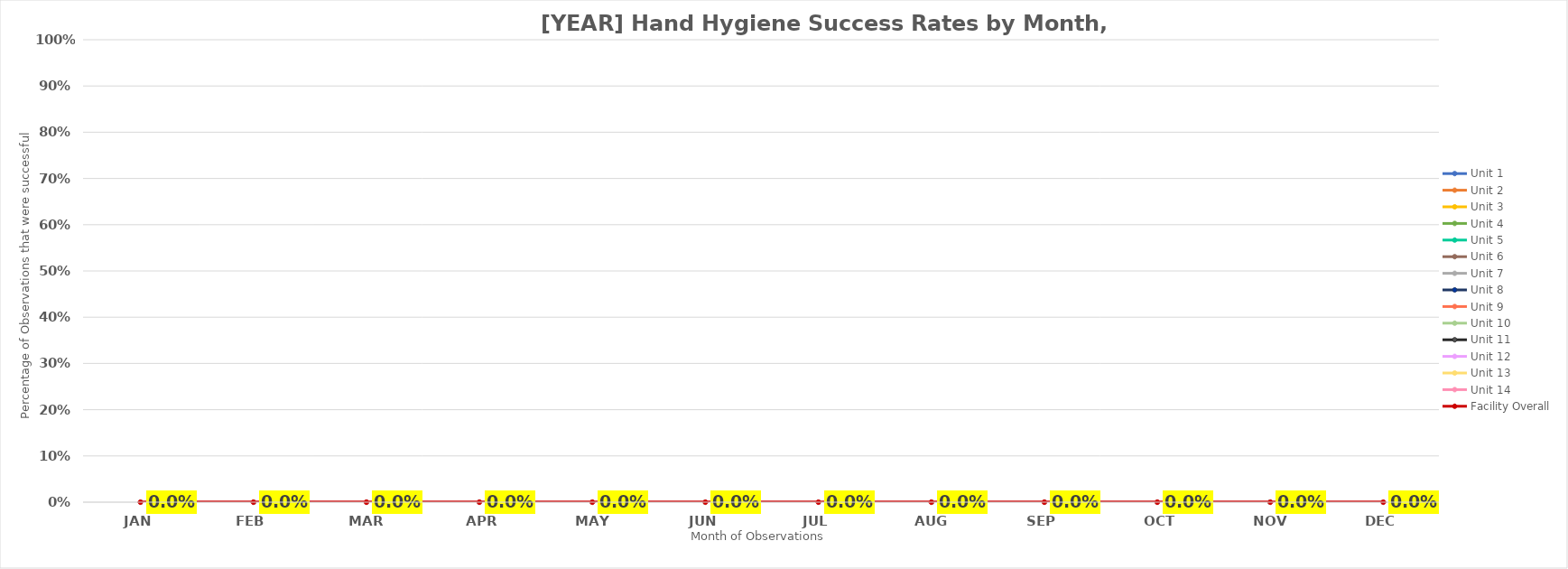
| Category | Unit 1 | Unit 2 | Unit 3 | Unit 4 | Unit 5 | Unit 6 | Unit 7 | Unit 8 | Unit 9 | Unit 10 | Unit 11 | Unit 12 | Unit 13 | Unit 14 | Facility Overall |
|---|---|---|---|---|---|---|---|---|---|---|---|---|---|---|---|
| JAN | 0 | 0 | 0 | 0 | 0 | 0 | 0 | 0 | 0 | 0 | 0 | 0 | 0 | 0 | 0 |
| FEB | 0 | 0 | 0 | 0 | 0 | 0 | 0 | 0 | 0 | 0 | 0 | 0 | 0 | 0 | 0 |
| MAR | 0 | 0 | 0 | 0 | 0 | 0 | 0 | 0 | 0 | 0 | 0 | 0 | 0 | 0 | 0 |
| APR | 0 | 0 | 0 | 0 | 0 | 0 | 0 | 0 | 0 | 0 | 0 | 0 | 0 | 0 | 0 |
| MAY | 0 | 0 | 0 | 0 | 0 | 0 | 0 | 0 | 0 | 0 | 0 | 0 | 0 | 0 | 0 |
| JUN | 0 | 0 | 0 | 0 | 0 | 0 | 0 | 0 | 0 | 0 | 0 | 0 | 0 | 0 | 0 |
| JUL | 0 | 0 | 0 | 0 | 0 | 0 | 0 | 0 | 0 | 0 | 0 | 0 | 0 | 0 | 0 |
| AUG | 0 | 0 | 0 | 0 | 0 | 0 | 0 | 0 | 0 | 0 | 0 | 0 | 0 | 0 | 0 |
| SEP | 0 | 0 | 0 | 0 | 0 | 0 | 0 | 0 | 0 | 0 | 0 | 0 | 0 | 0 | 0 |
| OCT | 0 | 0 | 0 | 0 | 0 | 0 | 0 | 0 | 0 | 0 | 0 | 0 | 0 | 0 | 0 |
| NOV | 0 | 0 | 0 | 0 | 0 | 0 | 0 | 0 | 0 | 0 | 0 | 0 | 0 | 0 | 0 |
| DEC | 0 | 0 | 0 | 0 | 0 | 0 | 0 | 0 | 0 | 0 | 0 | 0 | 0 | 0 | 0 |